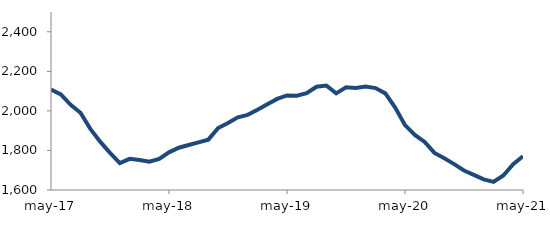
| Category | Series 0 |
|---|---|
| 2017-05-01 | 2107.618 |
| 2017-06-01 | 2083.325 |
| 2017-07-01 | 2030.99 |
| 2017-08-01 | 1990.738 |
| 2017-09-01 | 1908.873 |
| 2017-10-01 | 1844.49 |
| 2017-11-01 | 1788.112 |
| 2017-12-01 | 1736.148 |
| 2018-01-01 | 1757.409 |
| 2018-02-01 | 1751.839 |
| 2018-03-01 | 1742.835 |
| 2018-04-01 | 1757.68 |
| 2018-05-01 | 1790.41 |
| 2018-06-01 | 1813.611 |
| 2018-07-01 | 1827.454 |
| 2018-08-01 | 1840.806 |
| 2018-09-01 | 1854.733 |
| 2018-10-01 | 1913.472 |
| 2018-11-01 | 1938.819 |
| 2018-12-01 | 1967.481 |
| 2019-01-01 | 1980.122 |
| 2019-02-01 | 2005.664 |
| 2019-03-01 | 2033.637 |
| 2019-04-01 | 2060.76 |
| 2019-05-01 | 2078.07 |
| 2019-06-01 | 2076.377 |
| 2019-07-01 | 2089.152 |
| 2019-08-01 | 2121.901 |
| 2019-09-01 | 2128.491 |
| 2019-10-01 | 2088.553 |
| 2019-11-01 | 2119.211 |
| 2019-12-01 | 2116.27 |
| 2020-01-01 | 2123.179 |
| 2020-02-01 | 2115.217 |
| 2020-03-01 | 2088.6 |
| 2020-04-01 | 2017.196 |
| 2020-05-01 | 1928.056 |
| 2020-06-01 | 1878.793 |
| 2020-07-01 | 1843.079 |
| 2020-08-01 | 1787.318 |
| 2020-09-01 | 1760.041 |
| 2020-10-01 | 1730.797 |
| 2020-11-01 | 1698.405 |
| 2020-12-01 | 1676.693 |
| 2021-01-01 | 1653.561 |
| 2021-02-01 | 1641.346 |
| 2021-03-01 | 1673.136 |
| 2021-04-01 | 1730.094 |
| 2021-05-01 | 1770.762 |